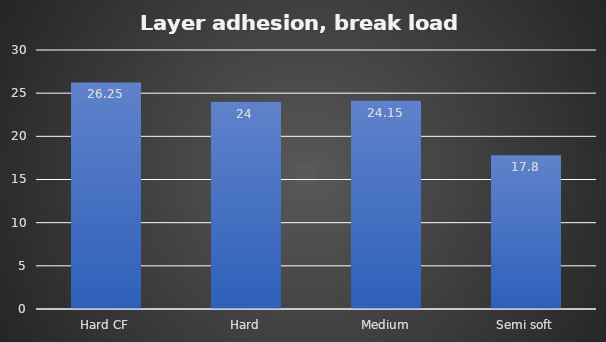
| Category | Average |
|---|---|
| Hard CF | 26.25 |
| Hard | 24 |
| Medium | 24.15 |
| Semi soft | 17.8 |